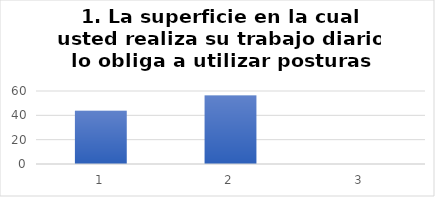
| Category | La superficie en la cual usted realiza su trabajo diario lo obliga a utilizar posturas inadecuadas.  |
|---|---|
| 0 | 43.75 |
| 1 | 56.25 |
| 2 | 0 |